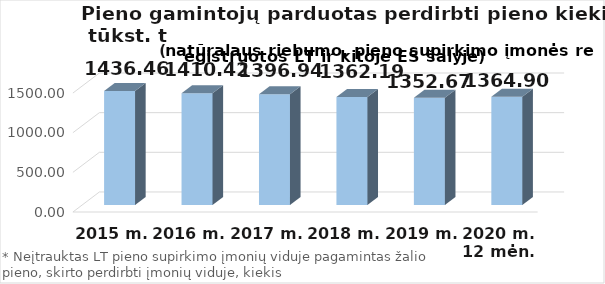
| Category | Viso |
|---|---|
| 2015 m. | 1436.455 |
| 2016 m. | 1410.42 |
| 2017 m.  | 1396.944 |
| 2018 m.  | 1362.189 |
| 2019 m.  | 1352.67 |
| 2020 m. 12 mėn. | 1364.9 |